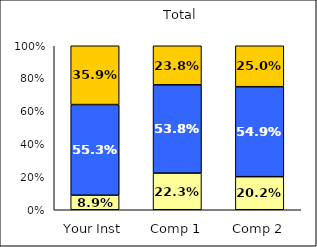
| Category | Low Social Self-Concept | Average Social Self-Concept | High Social Self-Concept |
|---|---|---|---|
| Your Inst | 0.089 | 0.553 | 0.359 |
| Comp 1 | 0.223 | 0.538 | 0.238 |
| Comp 2 | 0.202 | 0.549 | 0.25 |